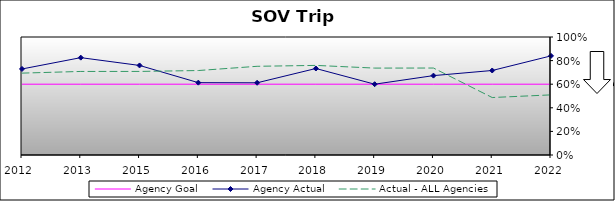
| Category | Agency Goal | Agency Actual | Actual - ALL Agencies |
|---|---|---|---|
| 2012.0 | 0.6 | 0.729 | 0.694 |
| 2013.0 | 0.6 | 0.825 | 0.708 |
| 2015.0 | 0.6 | 0.759 | 0.708 |
| 2016.0 | 0.6 | 0.613 | 0.716 |
| 2017.0 | 0.6 | 0.612 | 0.752 |
| 2018.0 | 0.6 | 0.733 | 0.759 |
| 2019.0 | 0.6 | 0.6 | 0.736 |
| 2020.0 | 0.6 | 0.673 | 0.737 |
| 2021.0 | 0.6 | 0.716 | 0.487 |
| 2022.0 | 0.6 | 0.84 | 0.509 |